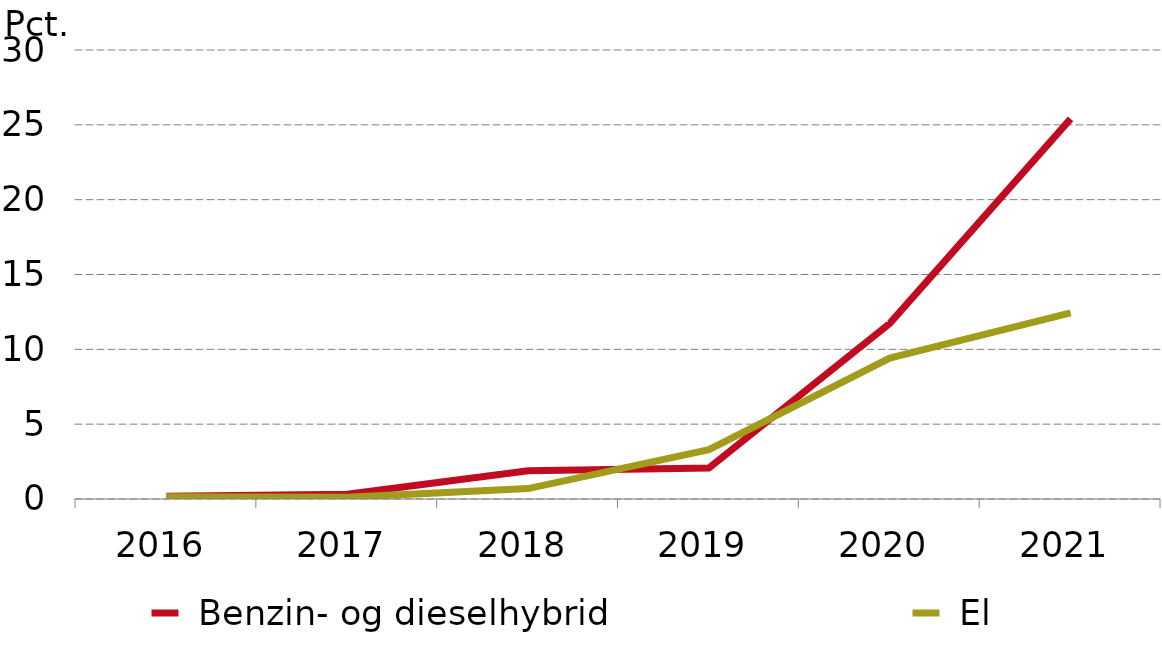
| Category |  Benzin- og dieselhybrid |  El |
|---|---|---|
| 2016.0 | 0.187 | 0.149 |
| 2017.0 | 0.323 | 0.111 |
| 2018.0 | 1.888 | 0.695 |
| 2019.0 | 2.075 | 3.295 |
| 2020.0 | 11.734 | 9.41 |
| 2021.0 | 25.399 | 12.441 |